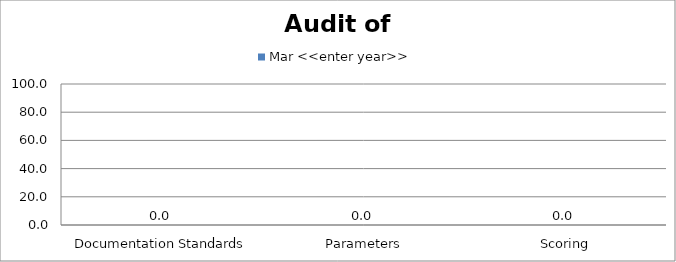
| Category | Mar <<enter year>> |
|---|---|
|  Documentation Standards | 0 |
|  Parameters | 0 |
|  Scoring | 0 |